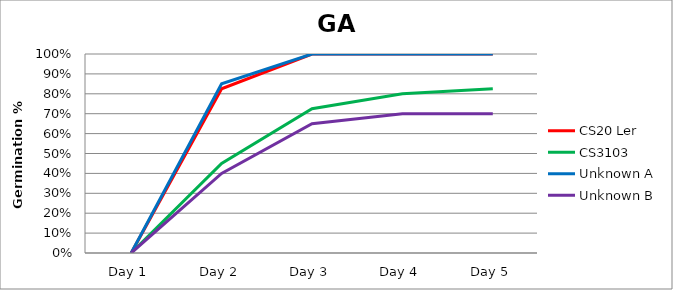
| Category | CS20 Ler | CS3103  | Unknown A | Unknown B |
|---|---|---|---|---|
| Day 1 | 0 | 0 | 0 | 0 |
| Day 2 | 0.825 | 0.45 | 0.85 | 0.4 |
| Day 3 | 1 | 0.725 | 1 | 0.65 |
| Day 4 | 1 | 0.8 | 1 | 0.7 |
| Day 5 | 1 | 0.825 | 1 | 0.7 |